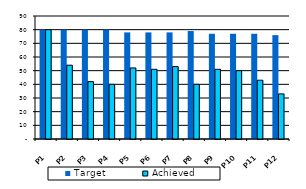
| Category | Target | Achieved  |
|---|---|---|
| P1 | 80 | 80 |
| P2 | 80 | 54 |
| P3 | 80 | 42 |
| P4 | 80 | 40 |
| P5 | 78 | 52 |
| P6 | 78 | 51 |
| P7 | 78 | 53 |
| P8 | 79 | 40 |
| P9 | 77 | 51 |
| P10 | 77 | 50 |
| P11 | 77 | 43 |
| P12 | 76 | 33 |